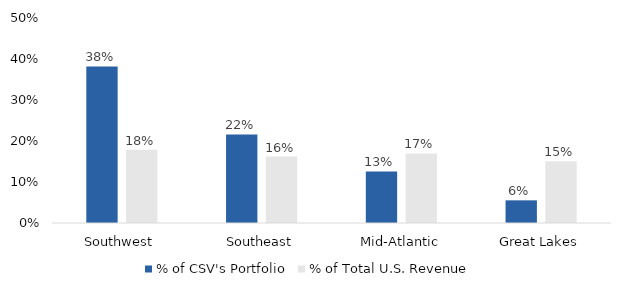
| Category | % of CSV's Portfolio | % of Total U.S. Revenue |
|---|---|---|
| Southwest | 0.382 | 0.178 |
| Southeast | 0.216 | 0.162 |
| Mid-Atlantic | 0.126 | 0.17 |
| Great Lakes | 0.055 | 0.151 |